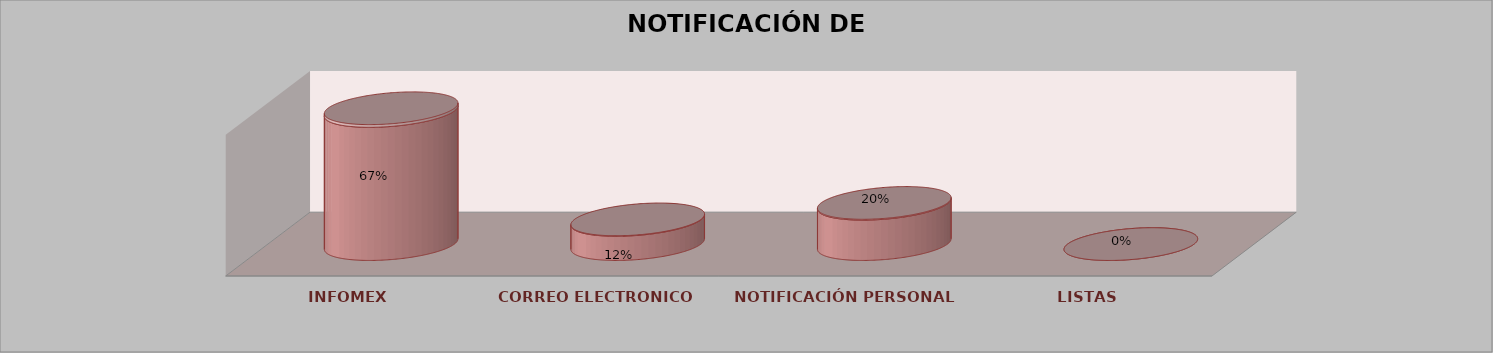
| Category | Series 0 | Series 1 | Series 2 | Series 3 | Series 4 |
|---|---|---|---|---|---|
| INFOMEX |  |  |  | 33 | 0.673 |
| CORREO ELECTRONICO |  |  |  | 6 | 0.122 |
| NOTIFICACIÓN PERSONAL |  |  |  | 10 | 0.204 |
| LISTAS |  |  |  | 0 | 0 |